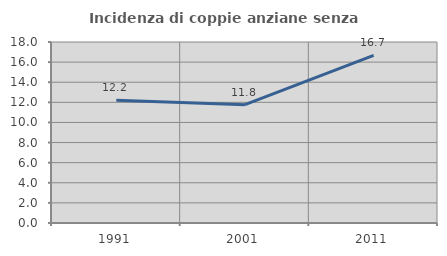
| Category | Incidenza di coppie anziane senza figli  |
|---|---|
| 1991.0 | 12.195 |
| 2001.0 | 11.765 |
| 2011.0 | 16.667 |